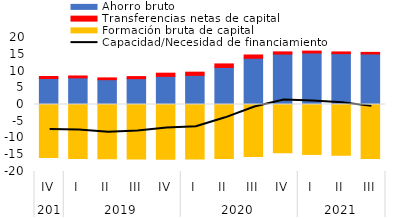
| Category | Ahorro bruto  | Transferencias netas de capital | Formación bruta de capital |
|---|---|---|---|
| 0 | 7.767 | 0.6 | -15.836 |
| 1 | 7.966 | 0.552 | -16.112 |
| 2 | 7.411 | 0.531 | -16.216 |
| 3 | 7.719 | 0.612 | -16.262 |
| 4 | 8.393 | 0.956 | -16.35 |
| 5 | 8.708 | 0.946 | -16.275 |
| 6 | 11.072 | 1.038 | -16.085 |
| 7 | 13.8 | 0.983 | -15.538 |
| 8 | 15.05 | 0.656 | -14.391 |
| 9 | 15.377 | 0.565 | -14.907 |
| 10 | 15.189 | 0.507 | -15.16 |
| 11 | 15.082 | 0.476 | -16.116 |